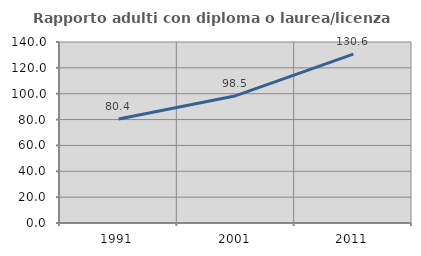
| Category | Rapporto adulti con diploma o laurea/licenza media  |
|---|---|
| 1991.0 | 80.374 |
| 2001.0 | 98.492 |
| 2011.0 | 130.626 |